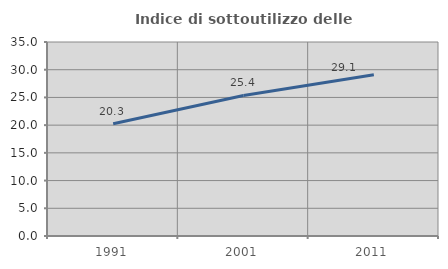
| Category | Indice di sottoutilizzo delle abitazioni  |
|---|---|
| 1991.0 | 20.252 |
| 2001.0 | 25.356 |
| 2011.0 | 29.097 |